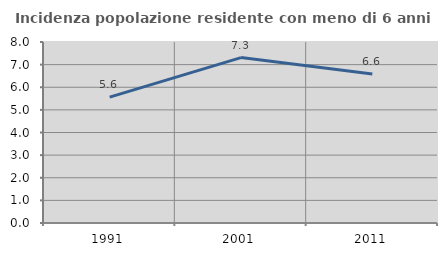
| Category | Incidenza popolazione residente con meno di 6 anni |
|---|---|
| 1991.0 | 5.565 |
| 2001.0 | 7.312 |
| 2011.0 | 6.581 |